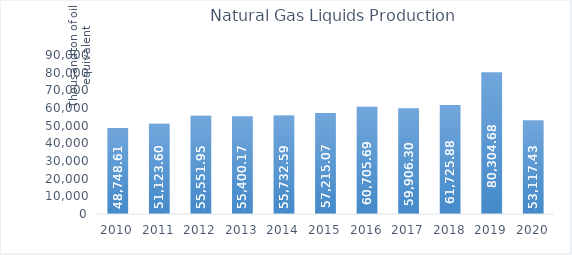
| Category | Natural Gas Liquids Production* |
|---|---|
| 2010.0 | 48748.61 |
| 2011.0 | 51123.6 |
| 2012.0 | 55551.95 |
| 2013.0 | 55400.17 |
| 2014.0 | 55732.59 |
| 2015.0 | 57215.07 |
| 2016.0 | 60705.69 |
| 2017.0 | 59906.3 |
| 2018.0 | 61725.88 |
| 2019.0 | 80304.68 |
| 2020.0 | 53117.43 |